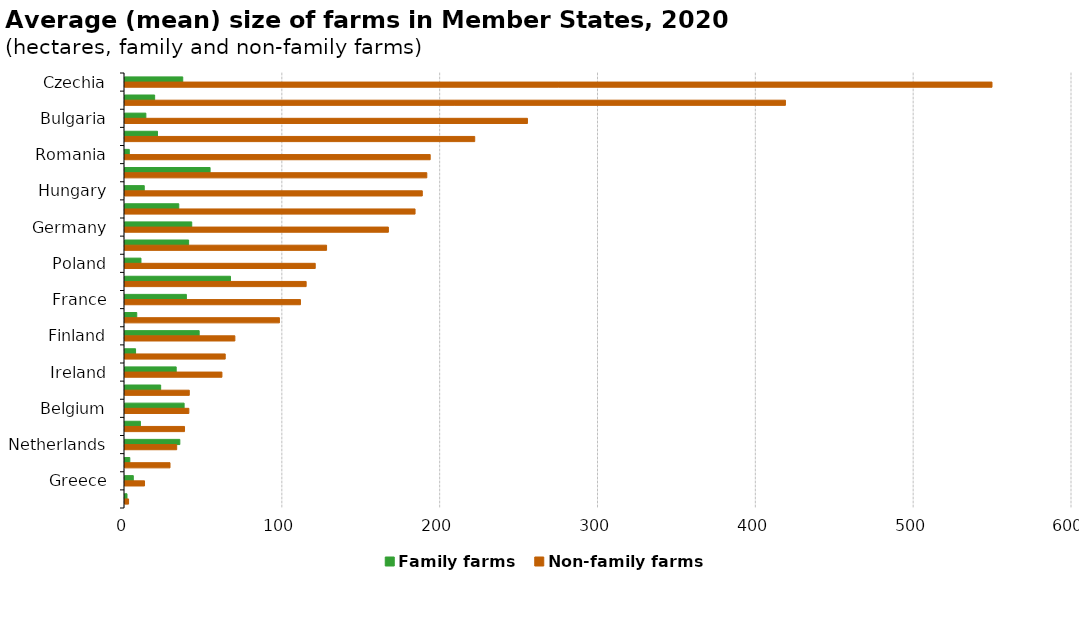
| Category | Family farms | Non-family farms |
|---|---|---|
| Czechia | 36.586 | 549.308 |
| Slovakia | 18.783 | 418.436 |
| Bulgaria | 13.218 | 254.982 |
| Latvia | 20.584 | 221.578 |
| Romania | 2.731 | 193.362 |
| Denmark | 53.91 | 191.216 |
| Hungary | 12.199 | 188.359 |
| Estonia | 34.068 | 183.77 |
| Germany | 42.282 | 166.878 |
| Sweden | 40.315 | 127.71 |
| Poland | 10.109 | 120.528 |
| Luxembourg | 66.833 | 114.776 |
| France | 38.883 | 111.168 |
| Portugal | 7.451 | 97.829 |
| Finland | 47 | 69.614 |
| Croatia | 6.694 | 63.487 |
| Ireland | 32.441 | 61.416 |
| Austria | 22.592 | 40.728 |
| Belgium | 37.459 | 40.466 |
| Italy | 9.749 | 37.71 |
| Netherlands | 34.746 | 32.755 |
| Cyprus | 3.051 | 28.513 |
| Greece | 5.261 | 12.374 |
| Malta | 1.261 | 2.26 |